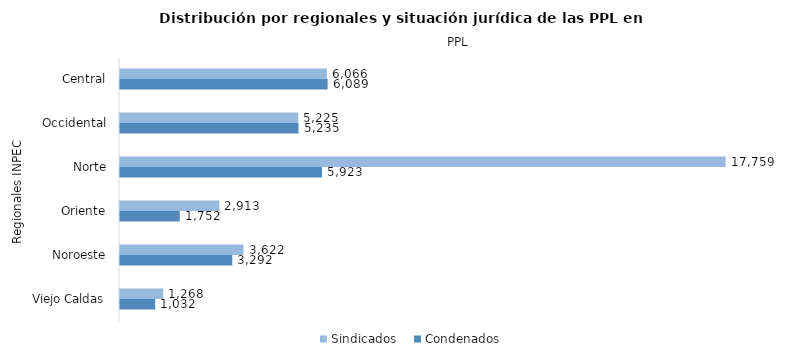
| Category | Sindicados | Condenados |
|---|---|---|
| Central | 6066 | 6089 |
| Occidental | 5225 | 5235 |
| Norte | 17759 | 5923 |
| Oriente | 2913 | 1752 |
| Noroeste | 3622 | 3292 |
| Viejo Caldas | 1268 | 1032 |